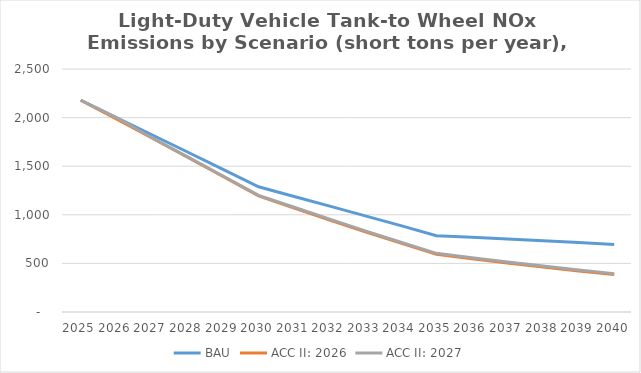
| Category | BAU | ACC II: 2026 | ACC II: 2027 |
|---|---|---|---|
| 2025.0 | 2178.601 | 2178.601 | 2178.601 |
| 2026.0 | 2000.613 | 1986.471 | 2000.613 |
| 2027.0 | 1823.416 | 1790.552 | 1792.933 |
| 2028.0 | 1645.865 | 1593.446 | 1597.133 |
| 2029.0 | 1467.715 | 1393.628 | 1398.678 |
| 2030.0 | 1288.354 | 1194.069 | 1200.263 |
| 2031.0 | 1188.987 | 1069.75 | 1077.249 |
| 2032.0 | 1089.182 | 946.158 | 954.722 |
| 2033.0 | 989.125 | 825.422 | 834.692 |
| 2034.0 | 888.837 | 708.392 | 717.988 |
| 2035.0 | 785.313 | 594.048 | 603.532 |
| 2036.0 | 768.326 | 548.824 | 558.902 |
| 2037.0 | 750.789 | 505.173 | 515.542 |
| 2038.0 | 732.631 | 463.149 | 473.538 |
| 2039.0 | 714.015 | 422.965 | 433.006 |
| 2040.0 | 694.622 | 385.562 | 394.872 |